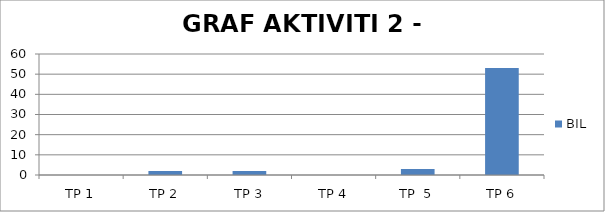
| Category | BIL |
|---|---|
| TP 1 | 0 |
| TP 2 | 2 |
|  TP 3 | 2 |
| TP 4 | 0 |
| TP  5 | 3 |
| TP 6 | 53 |